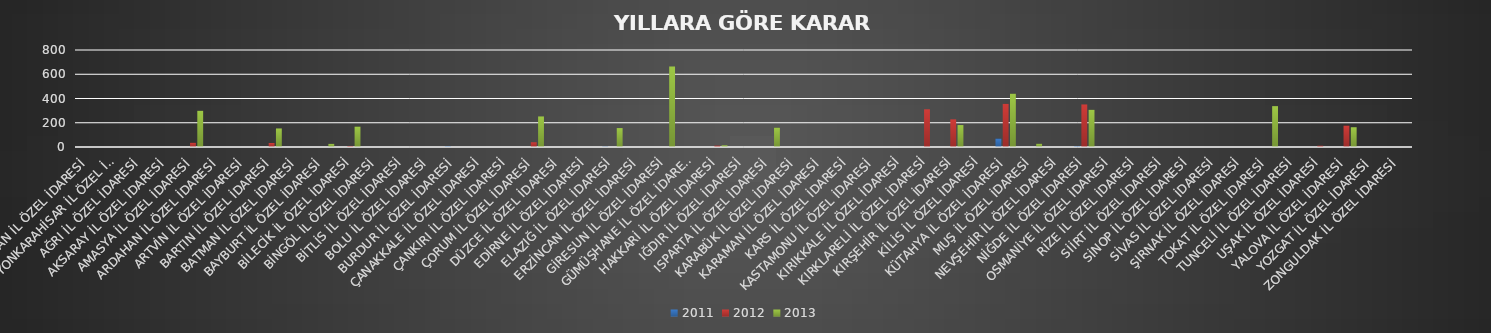
| Category | 2011 | 2012 | 2013 |
|---|---|---|---|
| ADIYAMAN İL ÖZEL İDARESİ | 0 | 0 | 0 |
| AFYONKARAHİSAR İL ÖZEL İDARESİ | 0 | 0 | 0 |
| AĞRI İL ÖZEL İDARESİ | 0 | 0 | 0 |
| AKSARAY İL ÖZEL İDARESİ | 0 | 0 | 0 |
| AMASYA İL ÖZEL İDARESİ | 0 | 35 | 299 |
| ARDAHAN İL ÖZEL İDARESİ | 0 | 0 | 0 |
| ARTVİN İL ÖZEL İDARESİ | 0 | 0 | 0 |
| BARTIN İL ÖZEL İDARESİ | 0 | 33 | 153 |
| BATMAN İL ÖZEL İDARESİ | 0 | 0 | 0 |
| BAYBURT İL ÖZEL İDARESİ | 0 | 0 | 26 |
| BİLECİK İL ÖZEL İDARESİ | 0 | 8 | 169 |
| BİNGÖL İL ÖZEL İDARESİ | 0 | 0 | 0 |
| BİTLİS İL ÖZEL İDARESİ | 0 | 0 | 0 |
| BOLU İL ÖZEL İDARESİ | 0 | 0 | 0 |
| BURDUR İL ÖZEL İDARESİ | 5 | 0 | 0 |
| ÇANAKKALE İL ÖZEL İDARESİ | 0 | 0 | 0 |
| ÇANKIRI İL ÖZEL İDARESİ | 0 | 0 | 0 |
| ÇORUM İL ÖZEL İDARESİ | 0 | 39 | 252 |
| DÜZCE İL ÖZEL İDARESİ | 0 | 0 | 0 |
| EDİRNE İL ÖZEL İDARESİ | 0 | 0 | 0 |
| ELAZIĞ İL ÖZEL İDARESİ | 4 | 0 | 156 |
| ERZİNCAN İL ÖZEL İDARESİ | 0 | 0 | 0 |
| GİRESUN İL ÖZEL İDARESİ | 0 | 0 | 664 |
| GÜMÜŞHANE İL ÖZEL İDARESİ | 0 | 0 | 0 |
| HAKKARİ İL ÖZEL İDARESİ | 0 | 12 | 14 |
| IĞDIR İL ÖZEL İDARESİ | 0 | 0 | 0 |
| ISPARTA İL ÖZEL İDARESİ | 0 | 0 | 160 |
| KARABÜK İL ÖZEL İDARESİ | 0 | 0 | 0 |
| KARAMAN İL ÖZEL İDARESİ | 0 | 0 | 0 |
| KARS İL ÖZEL İDARESİ | 0 | 0 | 0 |
| KASTAMONU İL ÖZEL İDARESİ | 0 | 0 | 0 |
| KIRIKKALE İL ÖZEL İDARESİ | 0 | 0 | 0 |
| KIRKLARELİ İL ÖZEL İDARESİ | 0 | 311 | 0 |
| KIRŞEHİR İL ÖZEL İDARESİ | 0 | 228 | 181 |
| KİLİS İL ÖZEL İDARESİ | 0 | 0 | 0 |
| KÜTAHYA İL ÖZEL İDARESİ | 70 | 356 | 440 |
| MUŞ İL ÖZEL İDARESİ | 0 | 0 | 27 |
| NEVŞEHİR İL ÖZEL İDARESİ | 0 | 0 | 0 |
| NİĞDE İL ÖZEL İDARESİ | 6 | 351 | 307 |
| OSMANİYE İL ÖZEL İDARESİ | 0 | 0 | 0 |
| RİZE İL ÖZEL İDARESİ | 0 | 0 | 0 |
| SİİRT İL ÖZEL İDARESİ | 0 | 0 | 0 |
| SİNOP İL ÖZEL İDARESİ | 0 | 0 | 0 |
| SİVAS İL ÖZEL İDARESİ | 0 | 0 | 0 |
| ŞIRNAK İL ÖZEL İDARESİ | 0 | 0 | 0 |
| TOKAT İL ÖZEL İDARESİ | 0 | 0 | 337 |
| TUNCELİ İL ÖZEL İDARESİ | 0 | 0 | 0 |
| UŞAK İL ÖZEL İDARESİ | 1 | 11 | 0 |
| YALOVA İL ÖZEL İDARESİ | 0 | 177 | 163 |
| YOZGAT İL ÖZEL İDARESİ | 0 | 0 | 0 |
| ZONGULDAK İL ÖZEL İDARESİ | 0 | 0 | 0 |